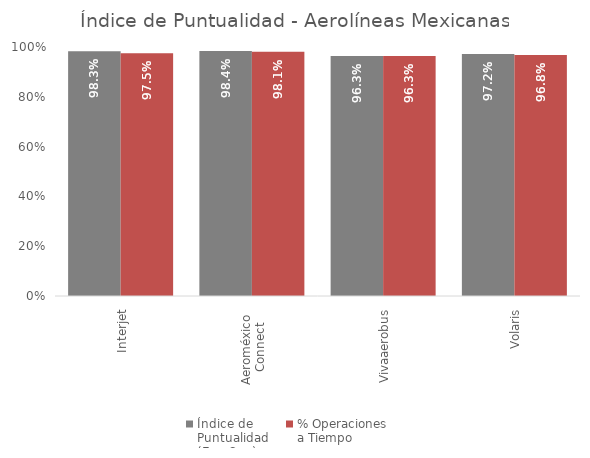
| Category | Índice de 
Puntualidad
(Ene-Sep) | % Operaciones 
a Tiempo |
|---|---|---|
| Interjet | 0.983 | 0.975 |
| Aeroméxico 
Connect | 0.984 | 0.981 |
| Vivaaerobus | 0.963 | 0.963 |
| Volaris | 0.972 | 0.968 |